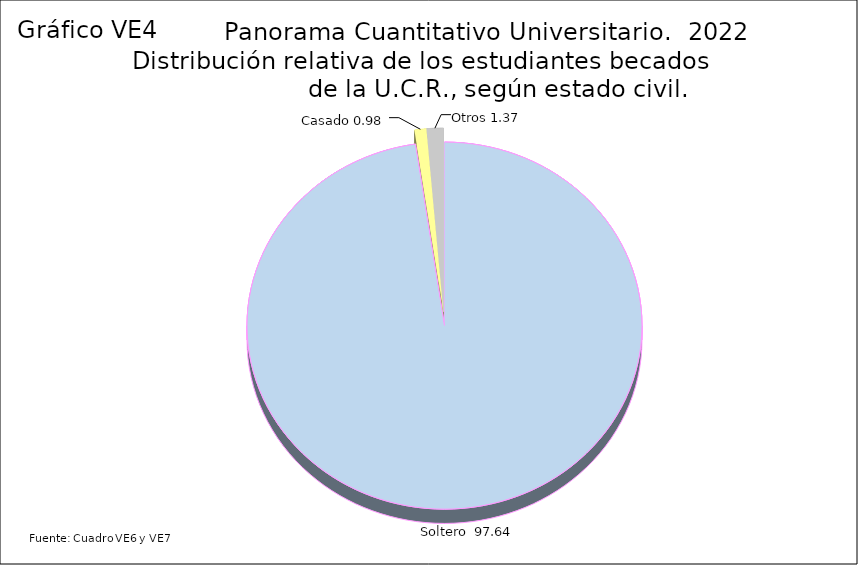
| Category | Series 3 |
|---|---|
| Soltero  | 97.64 |
| Casado | 0.98 |
| Otros | 1.37 |